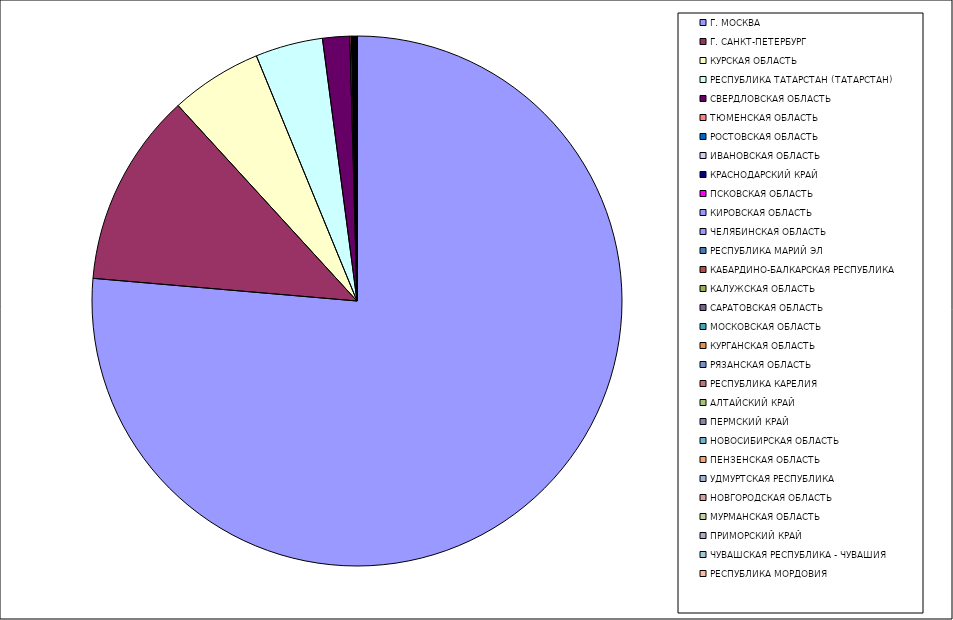
| Category | Оборот |
|---|---|
| Г. МОСКВА | 76.353 |
| Г. САНКТ-ПЕТЕРБУРГ | 11.839 |
| КУРСКАЯ ОБЛАСТЬ | 5.595 |
| РЕСПУБЛИКА ТАТАРСТАН (ТАТАРСТАН) | 4.115 |
| СВЕРДЛОВСКАЯ ОБЛАСТЬ | 1.651 |
| ТЮМЕНСКАЯ ОБЛАСТЬ | 0.095 |
| РОСТОВСКАЯ ОБЛАСТЬ | 0.05 |
| ИВАНОВСКАЯ ОБЛАСТЬ | 0.031 |
| КРАСНОДАРСКИЙ КРАЙ | 0.031 |
| ПСКОВСКАЯ ОБЛАСТЬ | 0.028 |
| КИРОВСКАЯ ОБЛАСТЬ | 0.027 |
| ЧЕЛЯБИНСКАЯ ОБЛАСТЬ | 0.021 |
| РЕСПУБЛИКА МАРИЙ ЭЛ | 0.021 |
| КАБАРДИНО-БАЛКАРСКАЯ РЕСПУБЛИКА | 0.02 |
| КАЛУЖСКАЯ ОБЛАСТЬ | 0.019 |
| САРАТОВСКАЯ ОБЛАСТЬ | 0.013 |
| МОСКОВСКАЯ ОБЛАСТЬ | 0.012 |
| КУРГАНСКАЯ ОБЛАСТЬ | 0.01 |
| РЯЗАНСКАЯ ОБЛАСТЬ | 0.008 |
| РЕСПУБЛИКА КАРЕЛИЯ | 0.007 |
| АЛТАЙСКИЙ КРАЙ | 0.006 |
| ПЕРМСКИЙ КРАЙ | 0.005 |
| НОВОСИБИРСКАЯ ОБЛАСТЬ | 0.005 |
| ПЕНЗЕНСКАЯ ОБЛАСТЬ | 0.004 |
| УДМУРТСКАЯ РЕСПУБЛИКА | 0.004 |
| НОВГОРОДСКАЯ ОБЛАСТЬ | 0.004 |
| МУРМАНСКАЯ ОБЛАСТЬ | 0.004 |
| ПРИМОРСКИЙ КРАЙ | 0.004 |
| ЧУВАШСКАЯ РЕСПУБЛИКА - ЧУВАШИЯ | 0.003 |
| РЕСПУБЛИКА МОРДОВИЯ | 0.003 |